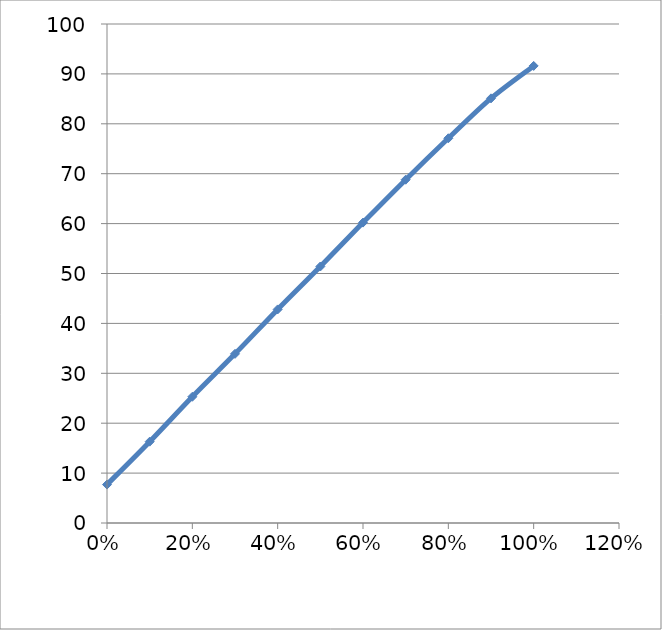
| Category | Series 0 |
|---|---|
| 1.0 | 91.6 |
| 0.9 | 85.1 |
| 0.8 | 77.1 |
| 0.7 | 68.8 |
| 0.6 | 60.2 |
| 0.5 | 51.4 |
| 0.4 | 42.8 |
| 0.3 | 33.9 |
| 0.2 | 25.3 |
| 0.1 | 16.3 |
| 0.0 | 7.7 |